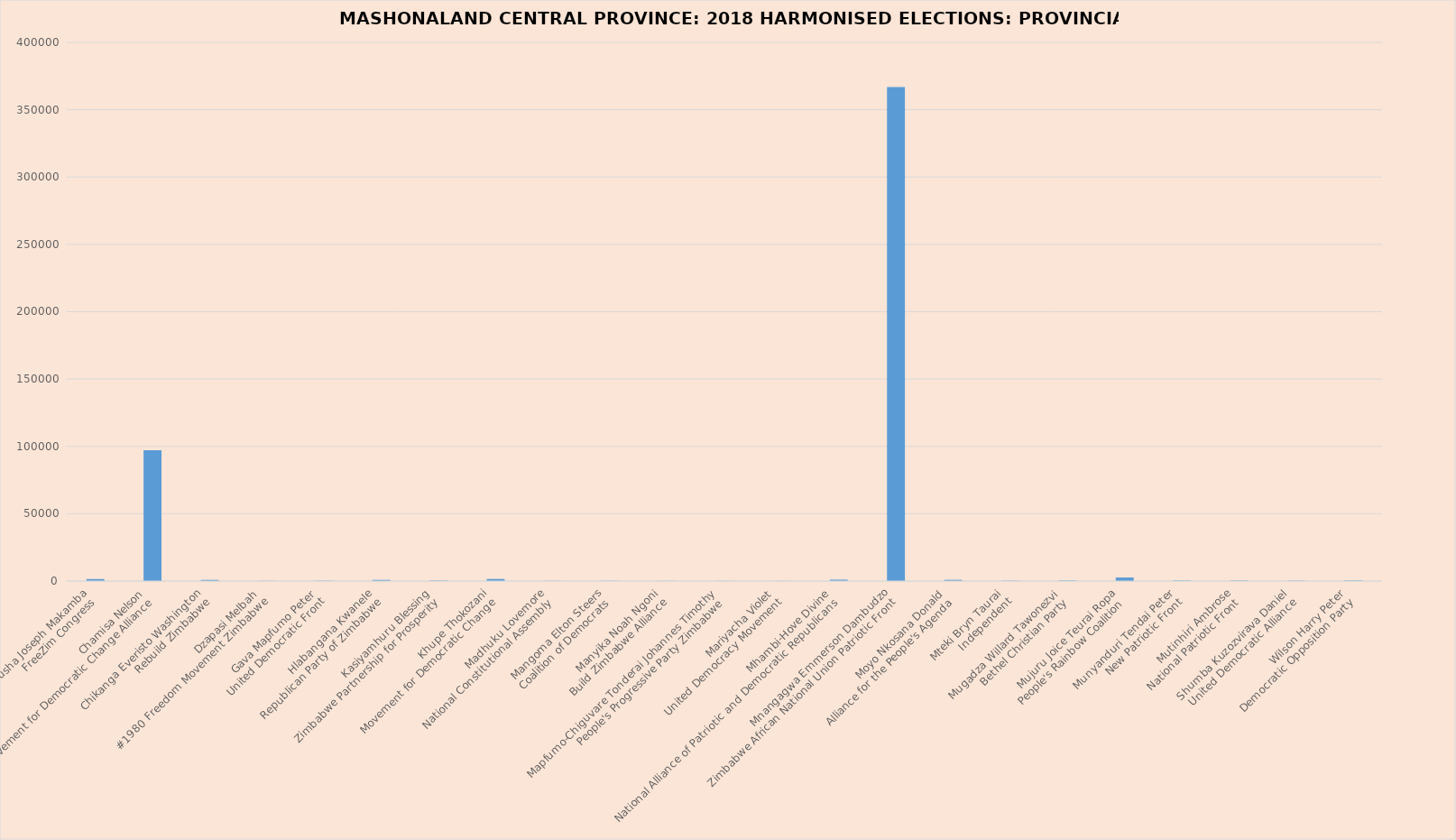
| Category | Series 0 |
|---|---|
| Busha Joseph Makamba
FreeZim Congress | 1480 |
| Chamisa Nelson
Movement for Democratic Change Alliance | 97097 |
| Chikanga Everisto Washington
Rebuild Zimbabwe | 872 |
| Dzapasi Melbah
#1980 Freedom Movement Zimbabwe | 151 |
| Gava Mapfumo Peter
United Democratic Front | 232 |
| Hlabangana Kwanele
Republican Party of Zimbabwe | 861 |
| Kasiyamhuru Blessing
Zimbabwe Partnership for Prosperity | 383 |
| Khupe Thokozani
Movement for Democratic Change | 1557 |
| Madhuku Lovemore
National Constitutional Assembly | 150 |
| Mangoma Elton Steers
Coalition of Democrats | 187 |
| Manyika Noah Ngoni
Build Zimbabwe Alliance | 139 |
| Mapfumo-Chiguvare Tonderai Johannes Timothy
People's Progressive Party Zimbabwe | 120 |
| Mariyacha Violet
United Democracy Movement | 110 |
| Mhambi-Hove Divine
National Alliance of Patriotic and Democratic Republicans | 1047 |
| Mnangagwa Emmerson Dambudzo
Zimbabwe African National Union Patriotic Front | 366785 |
| Moyo Nkosana Donald
Alliance for the People's Agenda | 907 |
| Mteki Bryn Taurai
Independent | 247 |
| Mugadza Willard Tawonezvi
Bethel Christian Party | 421 |
| Mujuru Joice Teurai Ropa
People's Rainbow Coalition | 2616 |
| Munyanduri Tendai Peter
New Patriotic Front | 413 |
| Mutinhiri Ambrose
National Patriotic Front | 373 |
| Shumba Kuzozvirava Daniel
United Democratic Alliance | 254 |
| Wilson Harry Peter
Democratic Opposition Party | 447 |